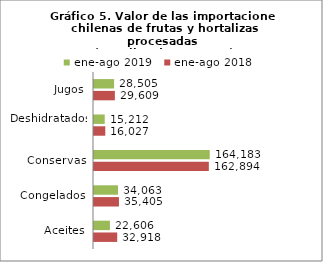
| Category | ene-ago 2018 | ene-ago 2019 |
|---|---|---|
| Aceites | 32917673.91 | 22606282.42 |
| Congelados | 35405022.5 | 34063220.21 |
| Conservas | 162894052.95 | 164182948.61 |
| Deshidratados | 16026966.62 | 15212316.11 |
| Jugos | 29608627.26 | 28505283.11 |